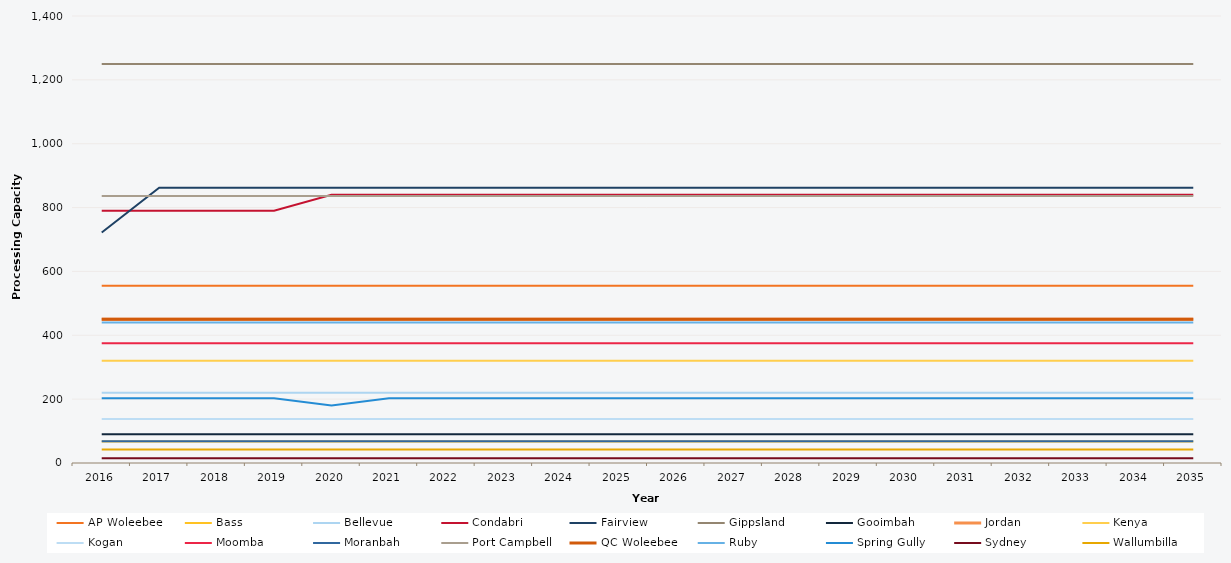
| Category | AP Woleebee | Bass | Bellevue | Condabri | Fairview | Gippsland | Gooimbah | Jordan | Kenya | Kogan | Moomba | Moranbah | Port Campbell | QC Woleebee | Ruby | Spring Gully | Sydney | Wallumbilla |
|---|---|---|---|---|---|---|---|---|---|---|---|---|---|---|---|---|---|---|
| 2016.0 | 555 | 67 | 220 | 790 | 722 | 1250 | 90 | 450 | 320 | 138 | 375 | 68 | 836 | 450 | 440 | 203 | 15 | 42 |
| 2017.0 | 555 | 67 | 220 | 790 | 862 | 1250 | 90 | 450 | 320 | 138 | 375 | 68 | 836 | 450 | 440 | 203 | 15 | 42 |
| 2018.0 | 555 | 67 | 220 | 790 | 862 | 1250 | 90 | 450 | 320 | 138 | 375 | 68 | 836 | 450 | 440 | 203 | 15 | 42 |
| 2019.0 | 555 | 67 | 220 | 790 | 862 | 1250 | 90 | 450 | 320 | 138 | 375 | 68 | 836 | 450 | 440 | 203 | 15 | 42 |
| 2020.0 | 555 | 67 | 220 | 840 | 862 | 1250 | 90 | 450 | 320 | 138 | 375 | 68 | 836 | 450 | 440 | 180 | 15 | 42 |
| 2021.0 | 555 | 67 | 220 | 840 | 862 | 1250 | 90 | 450 | 320 | 138 | 375 | 68 | 836 | 450 | 440 | 203 | 15 | 42 |
| 2022.0 | 555 | 67 | 220 | 840 | 862 | 1250 | 90 | 450 | 320 | 138 | 375 | 68 | 836 | 450 | 440 | 203 | 15 | 42 |
| 2023.0 | 555 | 67 | 220 | 840 | 862 | 1250 | 90 | 450 | 320 | 138 | 375 | 68 | 836 | 450 | 440 | 203 | 15 | 42 |
| 2024.0 | 555 | 67 | 220 | 840 | 862 | 1250 | 90 | 450 | 320 | 138 | 375 | 68 | 836 | 450 | 440 | 203 | 15 | 42 |
| 2025.0 | 555 | 67 | 220 | 840 | 862 | 1250 | 90 | 450 | 320 | 138 | 375 | 68 | 836 | 450 | 440 | 203 | 15 | 42 |
| 2026.0 | 555 | 67 | 220 | 840 | 862 | 1250 | 90 | 450 | 320 | 138 | 375 | 68 | 836 | 450 | 440 | 203 | 15 | 42 |
| 2027.0 | 555 | 67 | 220 | 840 | 862 | 1250 | 90 | 450 | 320 | 138 | 375 | 68 | 836 | 450 | 440 | 203 | 15 | 42 |
| 2028.0 | 555 | 67 | 220 | 840 | 862 | 1250 | 90 | 450 | 320 | 138 | 375 | 68 | 836 | 450 | 440 | 203 | 15 | 42 |
| 2029.0 | 555 | 67 | 220 | 840 | 862 | 1250 | 90 | 450 | 320 | 138 | 375 | 68 | 836 | 450 | 440 | 203 | 15 | 42 |
| 2030.0 | 555 | 67 | 220 | 840 | 862 | 1250 | 90 | 450 | 320 | 138 | 375 | 68 | 836 | 450 | 440 | 203 | 15 | 42 |
| 2031.0 | 555 | 67 | 220 | 840 | 862 | 1250 | 90 | 450 | 320 | 138 | 375 | 68 | 836 | 450 | 440 | 203 | 15 | 42 |
| 2032.0 | 555 | 67 | 220 | 840 | 862 | 1250 | 90 | 450 | 320 | 138 | 375 | 68 | 836 | 450 | 440 | 203 | 15 | 42 |
| 2033.0 | 555 | 67 | 220 | 840 | 862 | 1250 | 90 | 450 | 320 | 138 | 375 | 68 | 836 | 450 | 440 | 203 | 15 | 42 |
| 2034.0 | 555 | 67 | 220 | 840 | 862 | 1250 | 90 | 450 | 320 | 138 | 375 | 68 | 836 | 450 | 440 | 203 | 15 | 42 |
| 2035.0 | 555 | 67 | 220 | 840 | 862 | 1250 | 90 | 450 | 320 | 138 | 375 | 68 | 836 | 450 | 440 | 203 | 15 | 42 |